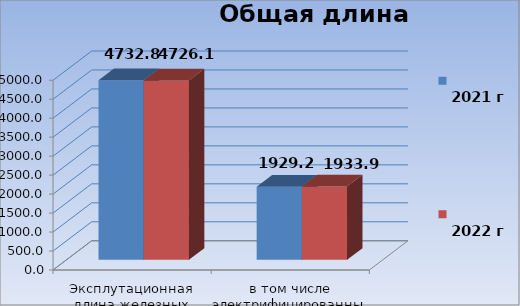
| Category | 
2021 г | 
2022 г |
|---|---|---|
| Эксплутационная длина железных дорог, км | 4732.8 | 4726.1 |
| в том числе электрифицированных дорог, км  | 1929.2 | 1933.9 |